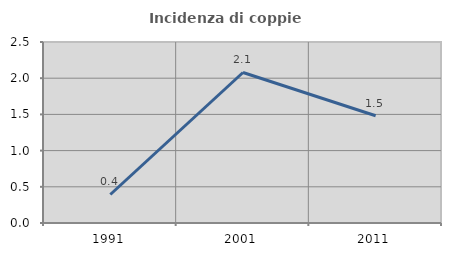
| Category | Incidenza di coppie miste |
|---|---|
| 1991.0 | 0.394 |
| 2001.0 | 2.079 |
| 2011.0 | 1.481 |